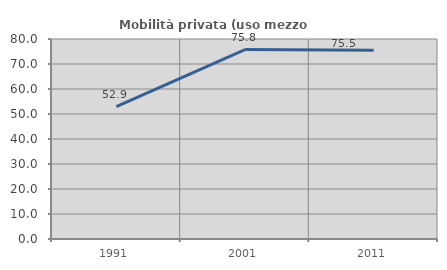
| Category | Mobilità privata (uso mezzo privato) |
|---|---|
| 1991.0 | 52.941 |
| 2001.0 | 75.758 |
| 2011.0 | 75.54 |